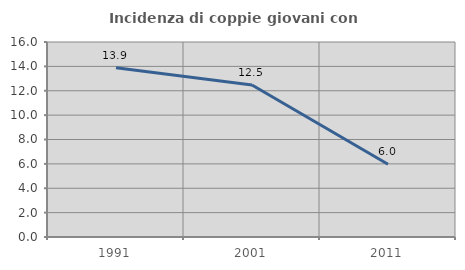
| Category | Incidenza di coppie giovani con figli |
|---|---|
| 1991.0 | 13.889 |
| 2001.0 | 12.468 |
| 2011.0 | 5.963 |